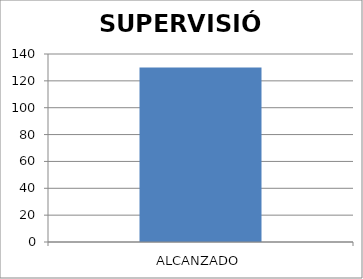
| Category | SUPERVISIÓN |
|---|---|
| ALCANZADO | 130 |